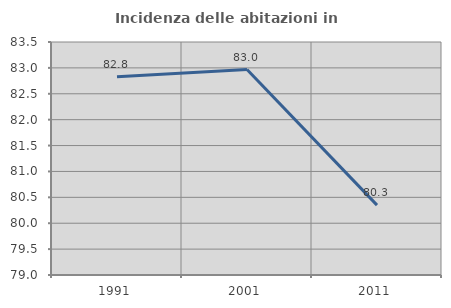
| Category | Incidenza delle abitazioni in proprietà  |
|---|---|
| 1991.0 | 82.828 |
| 2001.0 | 82.969 |
| 2011.0 | 80.349 |